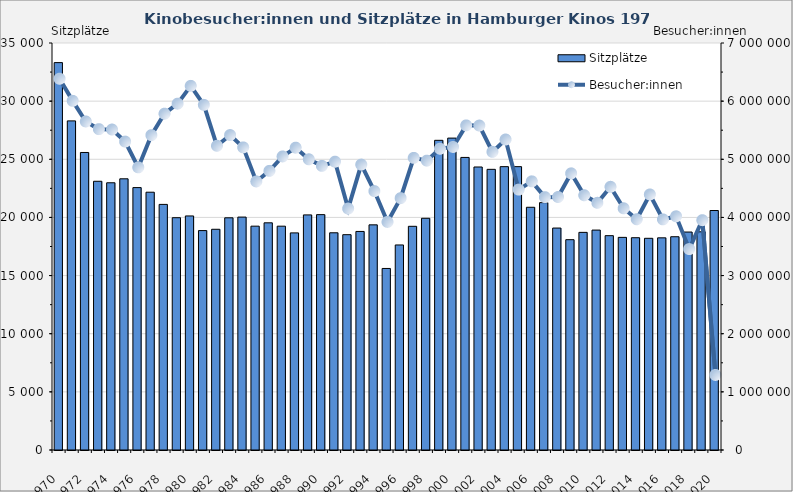
| Category | Sitzplätze |
|---|---|
| 0 | 33313 |
| 1 | 28302 |
| 2 | 25585 |
| 3 | 23109 |
| 4 | 22980 |
| 5 | 23322 |
| 6 | 22565 |
| 7 | 22169 |
| 8 | 21120 |
| 9 | 19977 |
| 10 | 20128 |
| 11 | 18869 |
| 12 | 18982 |
| 13 | 19967 |
| 14 | 20030 |
| 15 | 19249 |
| 16 | 19537 |
| 17 | 19248 |
| 18 | 18671 |
| 19 | 20217 |
| 20 | 20240 |
| 21 | 18679 |
| 22 | 18516 |
| 23 | 18794 |
| 24 | 19362 |
| 25 | 15612 |
| 26 | 17633 |
| 27 | 19237 |
| 28 | 19928 |
| 29 | 26631 |
| 30 | 26822 |
| 31 | 25160 |
| 32 | 24337 |
| 33 | 24136 |
| 34 | 24367 |
| 35 | 24367 |
| 36 | 20873 |
| 37 | 21273 |
| 38 | 19086 |
| 39 | 18087 |
| 40 | 18716 |
| 41 | 18912 |
| 42 | 18432 |
| 43 | 18286 |
| 44 | 18256 |
| 45 | 18205 |
| 46 | 18245 |
| 47 | 18341 |
| 48 | 18744 |
| 49 | 18764 |
| 50 | 20595 |